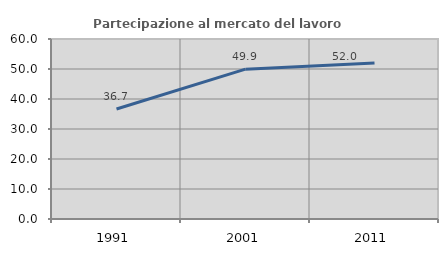
| Category | Partecipazione al mercato del lavoro  femminile |
|---|---|
| 1991.0 | 36.672 |
| 2001.0 | 49.944 |
| 2011.0 | 51.99 |